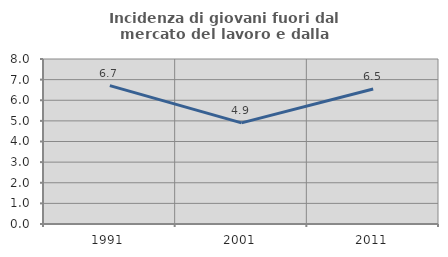
| Category | Incidenza di giovani fuori dal mercato del lavoro e dalla formazione  |
|---|---|
| 1991.0 | 6.706 |
| 2001.0 | 4.905 |
| 2011.0 | 6.542 |